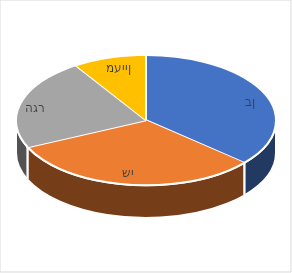
| Category | מכירות באפריל 2019 |
|---|---|
| בן | 800 |
| שי | 700 |
| הגר | 500 |
| מעיין | 200 |